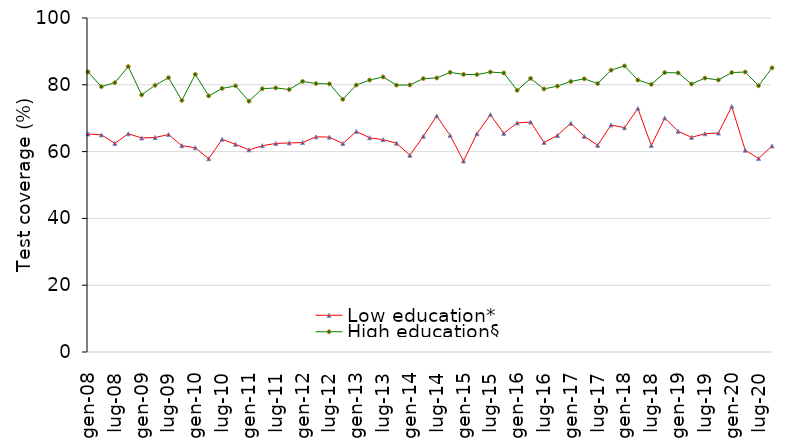
| Category | Low education* | High education§ |
|---|---|---|
| gen-08 | 65.293 | 83.858 |
| apr-08 | 65 | 79.443 |
| lug-08 | 62.474 | 80.632 |
| ott-08 | 65.352 | 85.456 |
| gen-09 | 64.093 | 76.988 |
| apr-09 | 64.22 | 79.843 |
| lug-09 | 65.104 | 82.122 |
| ott-09 | 61.782 | 75.336 |
| gen-10 | 61.153 | 83.108 |
| apr-10 | 57.87 | 76.683 |
| lug-10 | 63.694 | 78.902 |
| ott-10 | 62.192 | 79.686 |
| gen-11 | 60.533 | 75.098 |
| apr-11 | 61.76 | 78.833 |
| lug-11 | 62.444 | 79.062 |
| ott-11 | 62.592 | 78.586 |
| gen-12 | 62.713 | 81.008 |
| apr-12 | 64.42 | 80.373 |
| lug-12 | 64.334 | 80.272 |
| ott-12 | 62.412 | 75.646 |
| gen-13 | 66.023 | 79.918 |
| apr-13 | 64.15 | 81.423 |
| lug-13 | 63.574 | 82.342 |
| ott-13 | 62.532 | 79.906 |
| gen-14 | 58.913 | 79.958 |
| apr-14 | 64.6 | 81.853 |
| lug-14 | 70.684 | 82.042 |
| ott-14 | 64.832 | 83.726 |
| gen-15 | 57.203 | 83.098 |
| apr-15 | 65.37 | 83.053 |
| lug-15 | 71.054 | 83.822 |
| ott-15 | 65.462 | 83.536 |
| gen-16 | 68.593 | 78.358 |
| apr-16 | 68.85 | 81.893 |
| lug-16 | 62.734 | 78.752 |
| ott-16 | 64.842 | 79.606 |
| gen-17 | 68.483 | 80.998 |
| apr-17 | 64.58 | 81.793 |
| lug-17 | 61.894 | 80.362 |
| ott-17 | 67.982 | 84.386 |
| gen-18 | 67.153 | 85.648 |
| apr-18 | 72.89 | 81.423 |
| lug-18 | 61.804 | 80.122 |
| ott-18 | 70.052 | 83.656 |
| gen-19 | 66.103 | 83.558 |
| apr-19 | 64.28 | 80.253 |
| lug-19 | 65.344 | 82.012 |
| ott-19 | 65.562 | 81.446 |
| gen-20 | 73.493 | 83.668 |
| apr-20 | 60.44 | 83.823 |
| lug-20 | 57.924 | 79.742 |
| ott-20 | 61.682 | 85.066 |